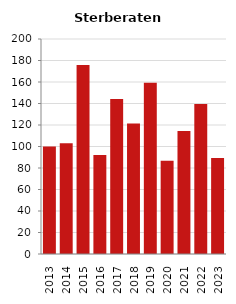
| Category | Sterberate der Bevölkerung ab 80 Jahre (auf Tsd.) |
|---|---|
| 2013.0 | 100 |
| 2014.0 | 103.139 |
| 2015.0 | 175.926 |
| 2016.0 | 92.105 |
| 2017.0 | 144.144 |
| 2018.0 | 121.339 |
| 2019.0 | 159.363 |
| 2020.0 | 86.792 |
| 2021.0 | 114.391 |
| 2022.0 | 139.623 |
| 2023.0 | 89.286 |